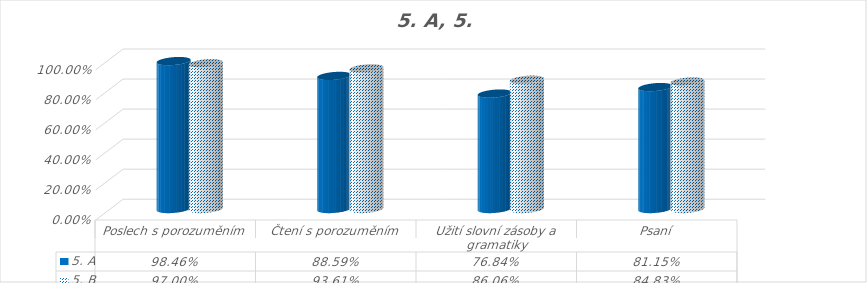
| Category | 5. A | 5. B |
|---|---|---|
| Poslech s porozuměním | 0.985 | 0.97 |
| Čtení s porozuměním | 0.886 | 0.936 |
| Užití slovní zásoby a gramatiky | 0.768 | 0.861 |
| Psaní | 0.812 | 0.848 |